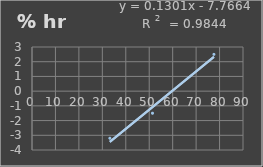
| Category | Humedad |
|---|---|
| 33.2 | -3.2 |
| 51.4 | -1.5 |
| 77.6 | 2.5 |